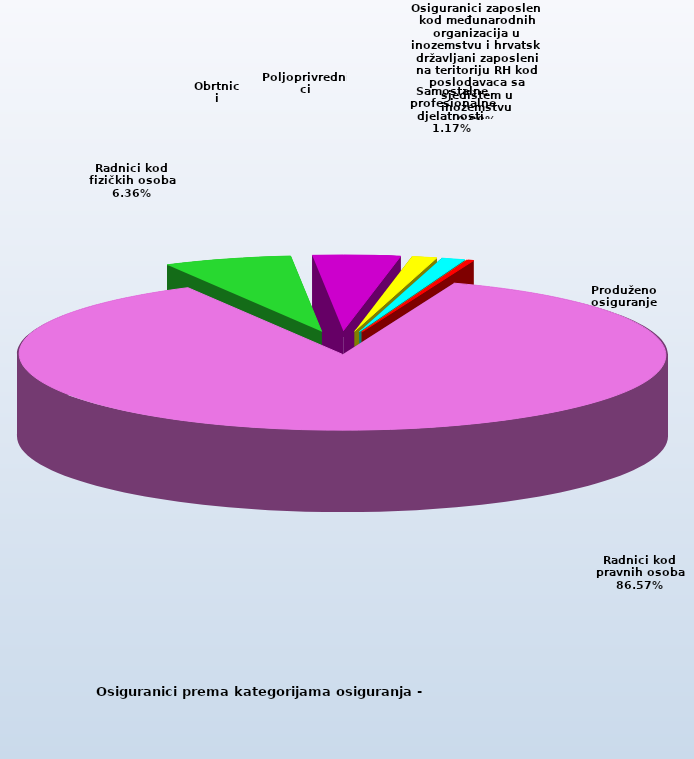
| Category | Series 0 |
|---|---|
| Radnici kod pravnih osoba | 1329872 |
| Radnici kod fizičkih osoba | 97670 |
| Obrtnici | 66701 |
| Poljoprivrednici | 19122 |
| Samostalne profesionalne djelatnosti  | 18010 |
| Osiguranici zaposleni kod međunarodnih organizacija u inozemstvu i hrvatski državljani zaposleni na teritoriju RH kod poslodavaca sa sjedištem u inozemstvu | 74 |
| Produženo osiguranje | 4798 |